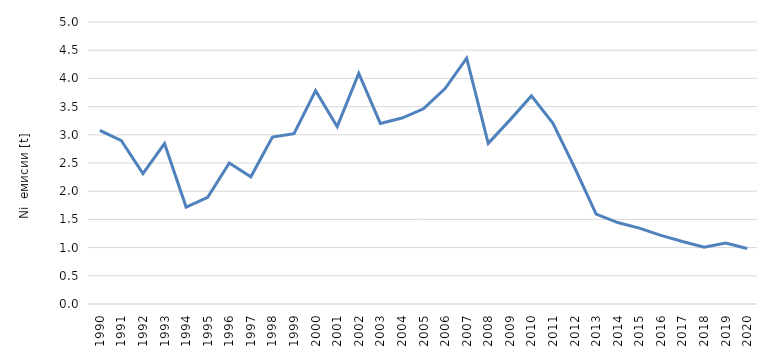
| Category | Series 0 |
|---|---|
| 1990.0 | 3.078 |
| 1991.0 | 2.897 |
| 1992.0 | 2.313 |
| 1993.0 | 2.845 |
| 1994.0 | 1.718 |
| 1995.0 | 1.891 |
| 1996.0 | 2.499 |
| 1997.0 | 2.256 |
| 1998.0 | 2.959 |
| 1999.0 | 3.019 |
| 2000.0 | 3.783 |
| 2001.0 | 3.144 |
| 2002.0 | 4.088 |
| 2003.0 | 3.201 |
| 2004.0 | 3.297 |
| 2005.0 | 3.46 |
| 2006.0 | 3.82 |
| 2007.0 | 4.357 |
| 2008.0 | 2.848 |
| 2009.0 | 3.26 |
| 2010.0 | 3.69 |
| 2011.0 | 3.204 |
| 2012.0 | 2.42 |
| 2013.0 | 1.593 |
| 2014.0 | 1.444 |
| 2015.0 | 1.346 |
| 2016.0 | 1.216 |
| 2017.0 | 1.107 |
| 2018.0 | 1.008 |
| 2019.0 | 1.079 |
| 2020.0 | 0.983 |